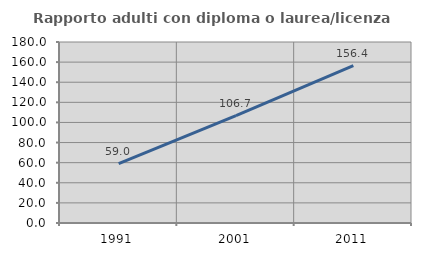
| Category | Rapporto adulti con diploma o laurea/licenza media  |
|---|---|
| 1991.0 | 59.034 |
| 2001.0 | 106.687 |
| 2011.0 | 156.427 |